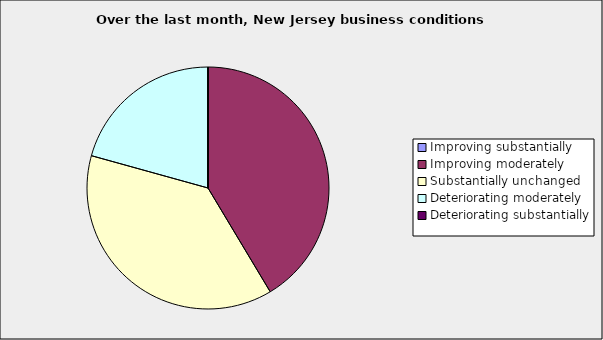
| Category | Series 0 |
|---|---|
| Improving substantially | 0 |
| Improving moderately | 0.414 |
| Substantially unchanged | 0.379 |
| Deteriorating moderately | 0.207 |
| Deteriorating substantially | 0 |